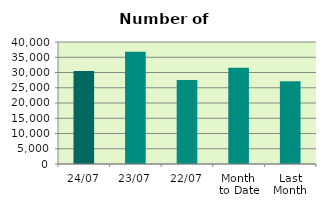
| Category | Series 0 |
|---|---|
| 24/07 | 30526 |
| 23/07 | 36836 |
| 22/07 | 27524 |
| Month 
to Date | 31529 |
| Last
Month | 27125.1 |